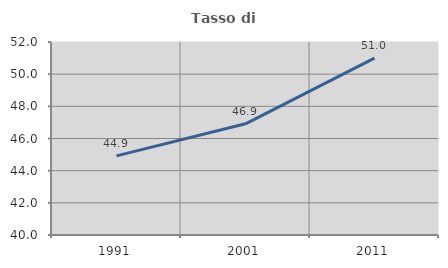
| Category | Tasso di occupazione   |
|---|---|
| 1991.0 | 44.917 |
| 2001.0 | 46.914 |
| 2011.0 | 50.998 |